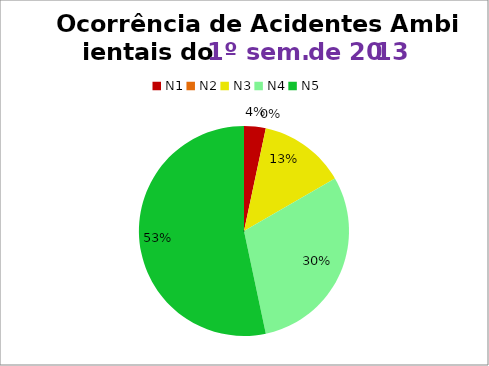
| Category | 1º/13 |
|---|---|
| N1 | 1 |
| N2 | 0 |
| N3 | 4 |
| N4 | 9 |
| N5 | 16 |